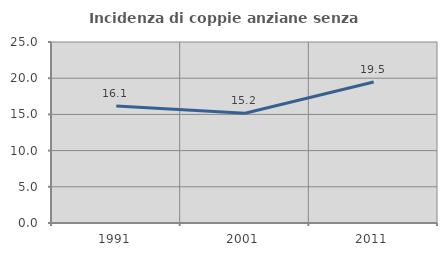
| Category | Incidenza di coppie anziane senza figli  |
|---|---|
| 1991.0 | 16.149 |
| 2001.0 | 15.169 |
| 2011.0 | 19.469 |